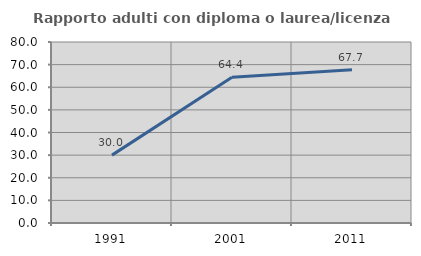
| Category | Rapporto adulti con diploma o laurea/licenza media  |
|---|---|
| 1991.0 | 30 |
| 2001.0 | 64.417 |
| 2011.0 | 67.742 |